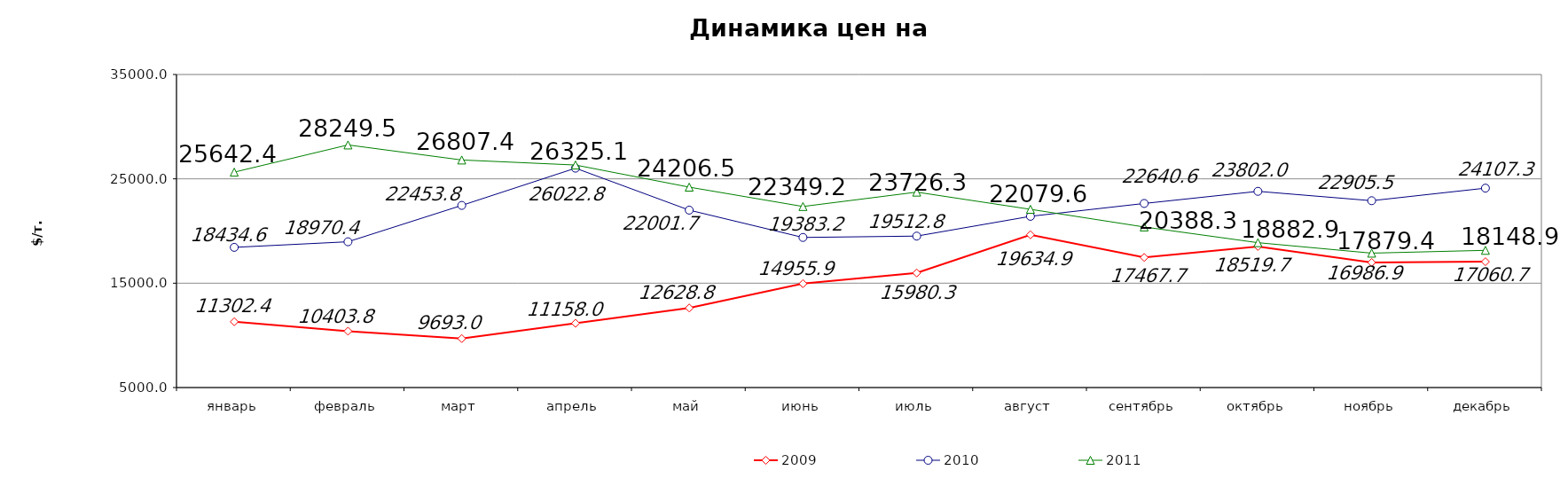
| Category | 2009 | 2010 | 2011 |
|---|---|---|---|
| январь | 11302.381 | 18434.625 | 25642.38 |
| февраль | 10403.75 | 18970.375 | 28249.5 |
| март | 9692.955 | 22453.8 | 26807.39 |
| апрель | 11158 | 26022.8 | 26325.14 |
| май | 12628.816 | 22001.71 | 24206.5 |
| июнь | 14955.91 | 19383.2 | 22349.21 |
| июль | 15980.326 | 19512.84 | 23726.31 |
| август | 19634.875 | 21408.93 | 22079.55 |
| сентябрь | 17467.727 | 22640.568 | 20388.3 |
| октябрь | 18519.659 | 23802.02 | 18882.859 |
| ноябрь | 16986.905 | 22905.46 | 17879.44 |
| декабрь | 17060.714 | 24107.26 | 18148.875 |